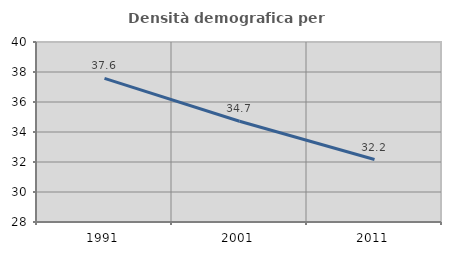
| Category | Densità demografica |
|---|---|
| 1991.0 | 37.577 |
| 2001.0 | 34.719 |
| 2011.0 | 32.165 |